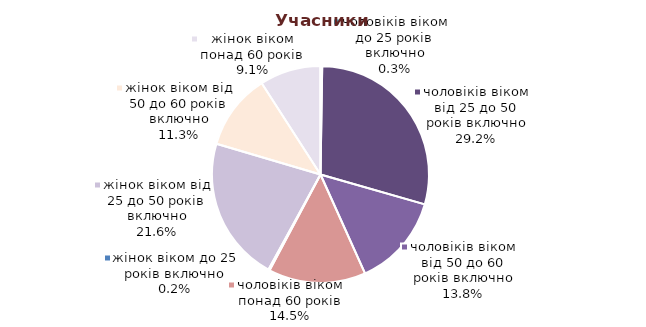
| Category | Series 0 |
|---|---|
| жінок віком до 25 років включно | 1677 |
| жінок віком від 25 до 50 років включно | 189045 |
| жінок віком від 50 до 60 років включно | 99089 |
| жінок віком понад 60 років | 79468 |
| чоловіків віком до 25 років включно | 2393 |
| чоловіків віком від 25 до 50 років включно | 255427 |
| чоловіків віком від 50 до 60 років включно | 121009 |
| чоловіків віком понад 60 років | 126962 |